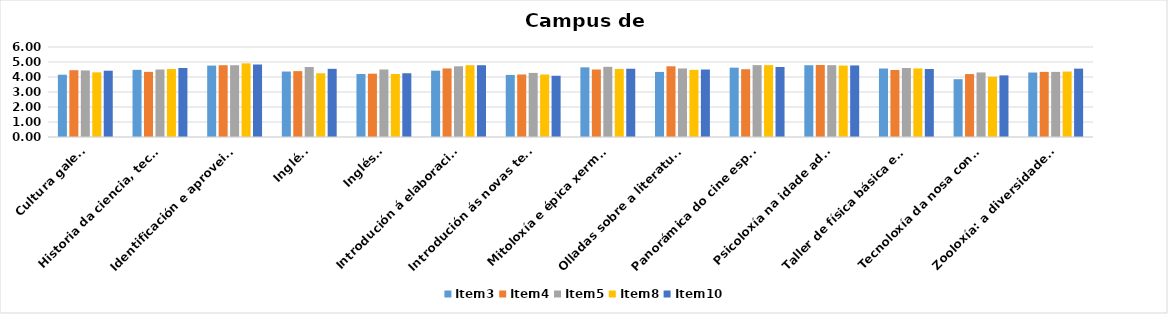
| Category | Item3 | Item4 | Item5 | Item8 | Item10 |
|---|---|---|---|---|---|
| Cultura galega | 4.151 | 4.455 | 4.438 | 4.31 | 4.419 |
| Historia da ciencia, tecnoloxía e cultura: ata o século XIV | 4.477 | 4.344 | 4.5 | 4.531 | 4.6 |
| Identificación e aproveitamento dos cogomelos | 4.762 | 4.786 | 4.786 | 4.909 | 4.833 |
| Inglés I | 4.365 | 4.391 | 4.667 | 4.25 | 4.545 |
| Inglés III | 4.2 | 4.222 | 4.5 | 4.2 | 4.25 |
| Introdución á elaboración de guións cinematográficos | 4.423 | 4.571 | 4.714 | 4.786 | 4.786 |
| Introdución ás novas tecnoloxías II | 4.139 | 4.167 | 4.273 | 4.167 | 4.083 |
| Mitoloxía e épica xermánicas | 4.644 | 4.5 | 4.679 | 4.536 | 4.552 |
| Olladas sobre a literatura galega | 4.337 | 4.714 | 4.571 | 4.476 | 4.5 |
| Panorámica do cine español dos anos 50 | 4.623 | 4.52 | 4.792 | 4.792 | 4.667 |
| Psicoloxía na idade adulta I | 4.784 | 4.8 | 4.788 | 4.765 | 4.771 |
| Taller de física básica e astronomía recreativa | 4.567 | 4.467 | 4.6 | 4.571 | 4.533 |
| Tecnoloxía da nosa contorna | 3.854 | 4.196 | 4.304 | 4.018 | 4.109 |
| Zooloxía: a diversidade do mundo animal | 4.298 | 4.341 | 4.341 | 4.364 | 4.558 |